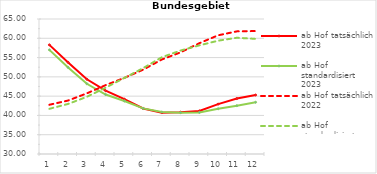
| Category | ab Hof tatsächlich 2023 | ab Hof standardisiert 2023 | ab Hof tatsächlich 2022 | ab Hof standardisiert 2022 |
|---|---|---|---|---|
| 0 | 58.293 | 57.001 | 42.767 | 41.716 |
| 1 | 53.749 | 52.436 | 43.863 | 42.977 |
| 2 | 49.385 | 48.205 | 45.723 | 44.826 |
| 3 | 46.405 | 45.418 | 47.852 | 47.199 |
| 4 | 44.208 | 43.735 | 49.734 | 49.724 |
| 5 | 41.8 | 41.825 | 51.859 | 52.259 |
| 6 | 40.724 | 40.875 | 54.504 | 55.09 |
| 7 | 40.84 | 40.722 | 56.36 | 56.83 |
| 8 | 41.167 | 40.766 | 58.729 | 58.171 |
| 9 | 42.931 | 41.713 | 60.773 | 59.377 |
| 10 | 44.38 | 42.525 | 61.795 | 60.135 |
| 11 | 45.29 | 43.414 | 61.876 | 59.852 |